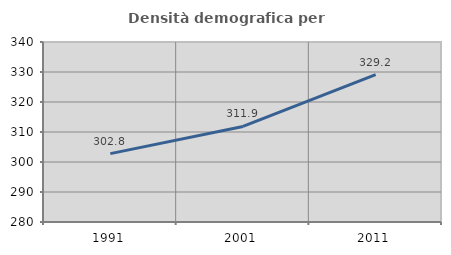
| Category | Densità demografica |
|---|---|
| 1991.0 | 302.791 |
| 2001.0 | 311.86 |
| 2011.0 | 329.15 |